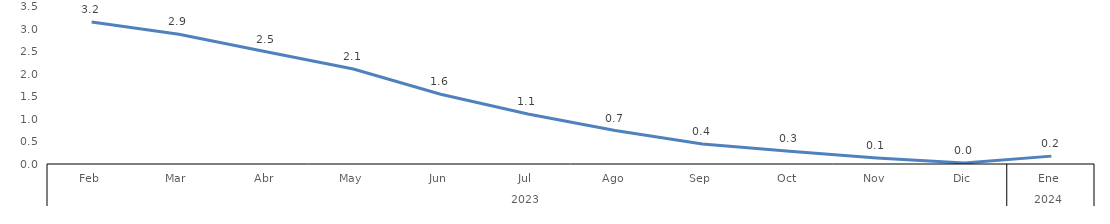
| Category | Bogotá |
|---|---|
| 0 | 3.168 |
| 1 | 2.894 |
| 2 | 2.503 |
| 3 | 2.116 |
| 4 | 1.555 |
| 5 | 1.116 |
| 6 | 0.745 |
| 7 | 0.445 |
| 8 | 0.286 |
| 9 | 0.135 |
| 10 | 0.022 |
| 11 | 0.176 |